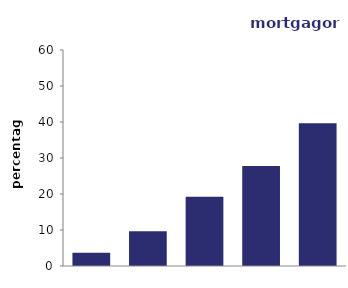
| Category | mortgagors |
|---|---|
| quintile 1 (lowest) | 3.674 |
| quintile 2 | 9.639 |
| quintile 3 | 19.27 |
| quintile 4 | 27.784 |
| quintile 5 (highest) | 39.634 |